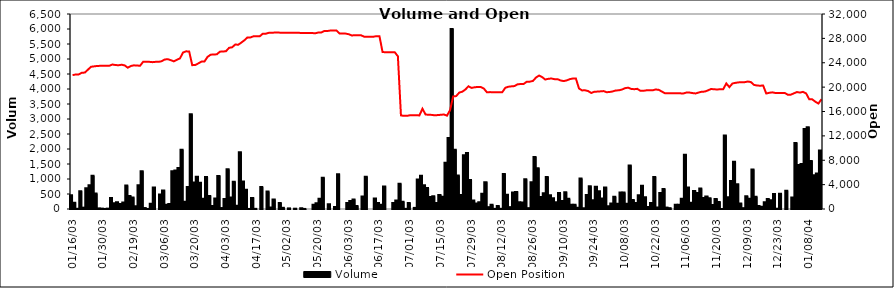
| Category | Volume  |
|---|---|
| 2003-01-16 | 457 |
| 2003-01-17 | 212 |
| 2003-01-20 | 7 |
| 2003-01-21 | 595 |
| 2003-01-22 | 45 |
| 2003-01-23 | 693 |
| 2003-01-24 | 790 |
| 2003-01-27 | 1108 |
| 2003-01-28 | 515 |
| 2003-01-29 | 20 |
| 2003-01-30 | 13 |
| 2003-02-05 | 2 |
| 2003-02-06 | 12 |
| 2003-02-07 | 368 |
| 2003-02-10 | 193 |
| 2003-02-11 | 227 |
| 2003-02-13 | 165 |
| 2003-02-14 | 220 |
| 2003-02-17 | 784 |
| 2003-02-18 | 432 |
| 2003-02-19 | 385 |
| 2003-02-20 | 95 |
| 2003-02-21 | 790 |
| 2003-02-24 | 1259 |
| 2003-02-25 | 32 |
| 2003-02-26 | 2 |
| 2003-02-27 | 171 |
| 2003-02-28 | 720 |
| 2003-03-03 | 0 |
| 2003-03-05 | 485 |
| 2003-03-06 | 615 |
| 2003-03-07 | 138 |
| 2003-03-10 | 165 |
| 2003-03-11 | 1260 |
| 2003-03-12 | 1282 |
| 2003-03-13 | 1370 |
| 2003-03-14 | 1975 |
| 2003-03-17 | 243 |
| 2003-03-18 | 736 |
| 2003-03-19 | 3155 |
| 2003-03-20 | 882 |
| 2003-03-21 | 1077 |
| 2003-03-24 | 878 |
| 2003-03-25 | 343 |
| 2003-03-26 | 1063 |
| 2003-03-27 | 437 |
| 2003-03-28 | 98 |
| 2003-03-31 | 351 |
| 2003-04-01 | 1100 |
| 2003-04-02 | 32 |
| 2003-04-03 | 335 |
| 2003-04-04 | 1322 |
| 2003-04-07 | 380 |
| 2003-04-08 | 911 |
| 2003-04-09 | 105 |
| 2003-04-10 | 1890 |
| 2003-04-11 | 915 |
| 2003-04-14 | 640 |
| 2003-04-15 | 2 |
| 2003-04-16 | 370 |
| 2003-04-17 | 5 |
| 2003-04-18 | 0 |
| 2003-04-21 | 730 |
| 2003-04-22 | 0 |
| 2003-04-23 | 581 |
| 2003-04-24 | 50 |
| 2003-04-25 | 315 |
| 2003-04-28 | 0 |
| 2003-04-29 | 200 |
| 2003-04-30 | 40 |
| 2003-05-02 | 0 |
| 2003-05-05 | 20 |
| 2003-05-06 | 0 |
| 2003-05-07 | 10 |
| 2003-05-08 | 0 |
| 2003-05-09 | 25 |
| 2003-05-12 | 2 |
| 2003-05-13 | 0 |
| 2003-05-16 | 0 |
| 2003-05-19 | 139 |
| 2003-05-20 | 195 |
| 2003-05-21 | 340 |
| 2003-05-22 | 1043 |
| 2003-05-23 | 0 |
| 2003-05-26 | 160 |
| 2003-05-27 | 0 |
| 2003-05-28 | 68 |
| 2003-05-29 | 1155 |
| 2003-05-30 | 0 |
| 2003-06-02 | 0 |
| 2003-06-03 | 200 |
| 2003-06-04 | 267 |
| 2003-06-05 | 320 |
| 2003-06-06 | 96 |
| 2003-06-09 | 0 |
| 2003-06-10 | 420 |
| 2003-06-11 | 1077 |
| 2003-06-12 | 0 |
| 2003-06-13 | 0 |
| 2003-06-16 | 350 |
| 2003-06-17 | 200 |
| 2003-06-18 | 138 |
| 2003-06-19 | 750 |
| 2003-06-20 | 0 |
| 2003-06-23 | 0 |
| 2003-06-24 | 200 |
| 2003-06-25 | 280 |
| 2003-06-26 | 845 |
| 2003-06-27 | 245 |
| 2003-06-30 | 5 |
| 2003-07-01 | 200 |
| 2003-07-02 | 0 |
| 2003-07-03 | 37 |
| 2003-07-04 | 980 |
| 2003-07-07 | 1110 |
| 2003-07-08 | 791 |
| 2003-07-09 | 700 |
| 2003-07-10 | 401 |
| 2003-07-11 | 423 |
| 2003-07-14 | 202 |
| 2003-07-15 | 469 |
| 2003-07-16 | 411 |
| 2003-07-17 | 1541 |
| 2003-07-18 | 2365 |
| 2003-07-21 | 6001 |
| 2003-07-22 | 1976 |
| 2003-07-23 | 1114 |
| 2003-07-24 | 464 |
| 2003-07-25 | 1790 |
| 2003-07-28 | 1865 |
| 2003-07-29 | 966 |
| 2003-07-30 | 281 |
| 2003-07-31 | 180 |
| 2003-08-01 | 223 |
| 2003-08-04 | 505 |
| 2003-08-05 | 894 |
| 2003-08-06 | 61 |
| 2003-08-07 | 142 |
| 2003-08-08 | 5 |
| 2003-08-11 | 96 |
| 2003-08-12 | 7 |
| 2003-08-13 | 1165 |
| 2003-08-14 | 479 |
| 2003-08-15 | 62 |
| 2003-08-18 | 548 |
| 2003-08-19 | 569 |
| 2003-08-20 | 222 |
| 2003-08-21 | 220 |
| 2003-08-22 | 990 |
| 2003-08-25 | 28 |
| 2003-08-26 | 889 |
| 2003-08-27 | 1733 |
| 2003-08-28 | 1358 |
| 2003-08-29 | 398 |
| 2003-09-02 | 521 |
| 2003-09-03 | 1067 |
| 2003-09-04 | 460 |
| 2003-09-05 | 359 |
| 2003-09-08 | 222 |
| 2003-09-09 | 530 |
| 2003-09-10 | 264 |
| 2003-09-11 | 562 |
| 2003-09-12 | 339 |
| 2003-09-15 | 145 |
| 2003-09-16 | 143 |
| 2003-09-17 | 41 |
| 2003-09-18 | 1015 |
| 2003-09-19 | 25 |
| 2003-09-22 | 470 |
| 2003-09-23 | 757 |
| 2003-09-24 | 291 |
| 2003-09-25 | 744 |
| 2003-09-26 | 595 |
| 2003-09-29 | 350 |
| 2003-09-30 | 715 |
| 2003-10-01 | 94 |
| 2003-10-02 | 187 |
| 2003-10-03 | 409 |
| 2003-10-06 | 176 |
| 2003-10-07 | 549 |
| 2003-10-08 | 547 |
| 2003-10-09 | 179 |
| 2003-10-10 | 1454 |
| 2003-10-13 | 299 |
| 2003-10-14 | 196 |
| 2003-10-15 | 460 |
| 2003-10-16 | 776 |
| 2003-10-17 | 393 |
| 2003-10-20 | 70 |
| 2003-10-21 | 198 |
| 2003-10-22 | 1068 |
| 2003-10-23 | 51 |
| 2003-10-27 | 532 |
| 2003-10-28 | 664 |
| 2003-10-29 | 47 |
| 2003-10-30 | 28 |
| 2003-10-31 | 0 |
| 2003-11-03 | 139 |
| 2003-11-04 | 143 |
| 2003-11-05 | 340 |
| 2003-11-06 | 1805 |
| 2003-11-07 | 718 |
| 2003-11-10 | 211 |
| 2003-11-11 | 602 |
| 2003-11-12 | 533 |
| 2003-11-13 | 687 |
| 2003-11-14 | 370 |
| 2003-11-17 | 418 |
| 2003-11-18 | 360 |
| 2003-11-19 | 132 |
| 2003-11-20 | 330 |
| 2003-11-21 | 235 |
| 2003-11-27 | 1 |
| 2003-11-28 | 2450 |
| 2003-12-01 | 390 |
| 2003-12-02 | 934 |
| 2003-12-03 | 1577 |
| 2003-12-04 | 826 |
| 2003-12-05 | 187 |
| 2003-12-08 | 28 |
| 2003-12-09 | 429 |
| 2003-12-10 | 338 |
| 2003-12-11 | 1319 |
| 2003-12-12 | 409 |
| 2003-12-15 | 102 |
| 2003-12-16 | 72 |
| 2003-12-17 | 227 |
| 2003-12-18 | 337 |
| 2003-12-19 | 293 |
| 2003-12-22 | 503 |
| 2003-12-23 | 10 |
| 2003-12-24 | 511 |
| 2003-12-26 | 0 |
| 2003-12-29 | 610 |
| 2003-12-30 | 0 |
| 2003-12-31 | 386 |
| 2004-01-02 | 2204 |
| 2004-01-05 | 1465 |
| 2004-01-06 | 1498 |
| 2004-01-07 | 2663 |
| 2004-01-08 | 2728 |
| 2004-01-09 | 1600 |
| 2004-01-12 | 1127 |
| 2004-01-13 | 1182 |
| 2004-01-14 | 1946 |